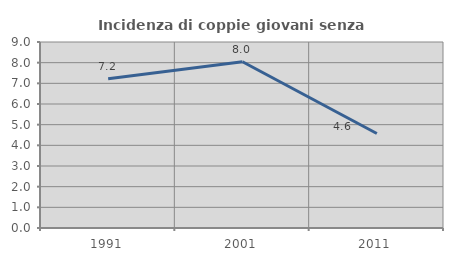
| Category | Incidenza di coppie giovani senza figli |
|---|---|
| 1991.0 | 7.216 |
| 2001.0 | 8.042 |
| 2011.0 | 4.575 |